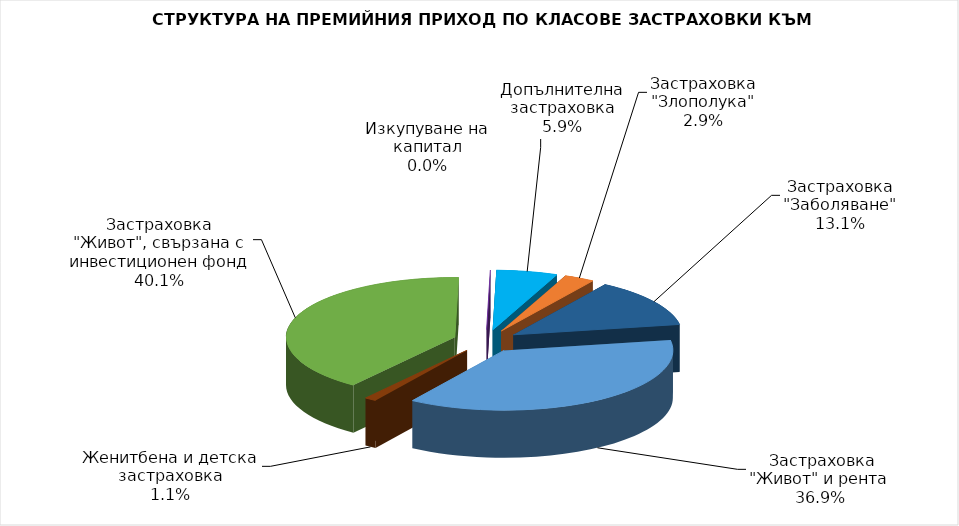
| Category |  Застраховка "Живот" и рента |
|---|---|
|  Застраховка "Живот" и рента | 162074048.194 |
| Женитбена и детска застраховка | 4968401.825 |
| Застраховка "Живот", свързана с инвестиционен фонд | 176116817.101 |
| Изкупуване на капитал | 0 |
| Допълнителна застраховка | 25719638.363 |
| Застраховка "Злополука" | 12796617.391 |
| Застраховка "Заболяване" | 57530756.757 |